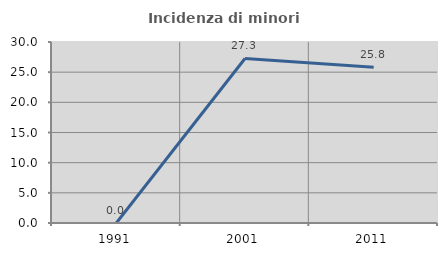
| Category | Incidenza di minori stranieri |
|---|---|
| 1991.0 | 0 |
| 2001.0 | 27.273 |
| 2011.0 | 25.806 |